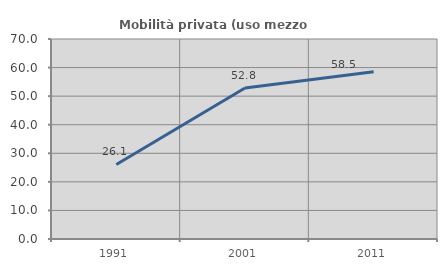
| Category | Mobilità privata (uso mezzo privato) |
|---|---|
| 1991.0 | 26.094 |
| 2001.0 | 52.834 |
| 2011.0 | 58.546 |